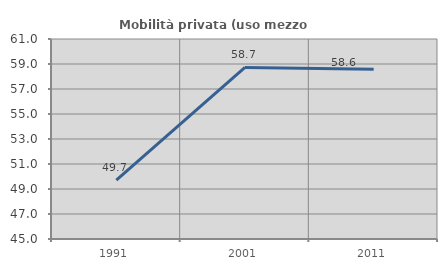
| Category | Mobilità privata (uso mezzo privato) |
|---|---|
| 1991.0 | 49.718 |
| 2001.0 | 58.723 |
| 2011.0 | 58.584 |